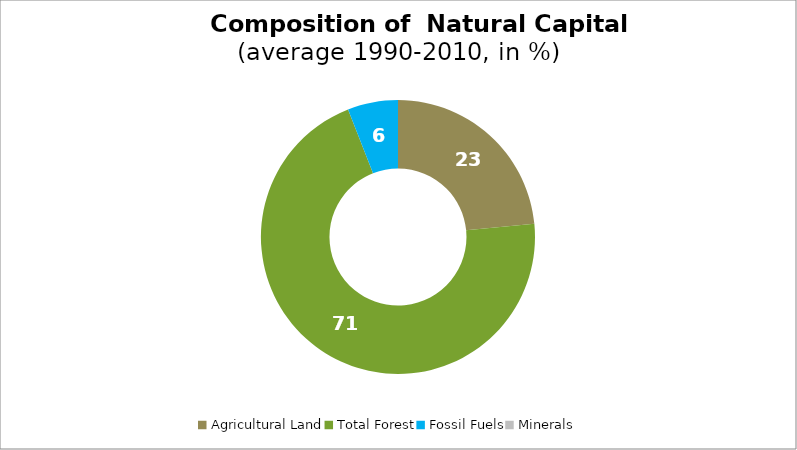
| Category | Series 0 |
|---|---|
| Agricultural Land | 23.447 |
| Total Forest | 70.615 |
| Fossil Fuels | 5.938 |
| Minerals | 0 |